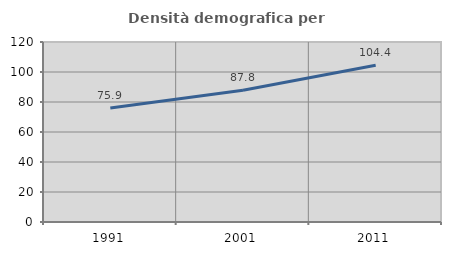
| Category | Densità demografica |
|---|---|
| 1991.0 | 75.93 |
| 2001.0 | 87.827 |
| 2011.0 | 104.447 |